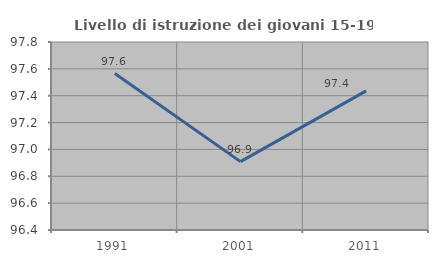
| Category | Livello di istruzione dei giovani 15-19 anni |
|---|---|
| 1991.0 | 97.565 |
| 2001.0 | 96.909 |
| 2011.0 | 97.436 |